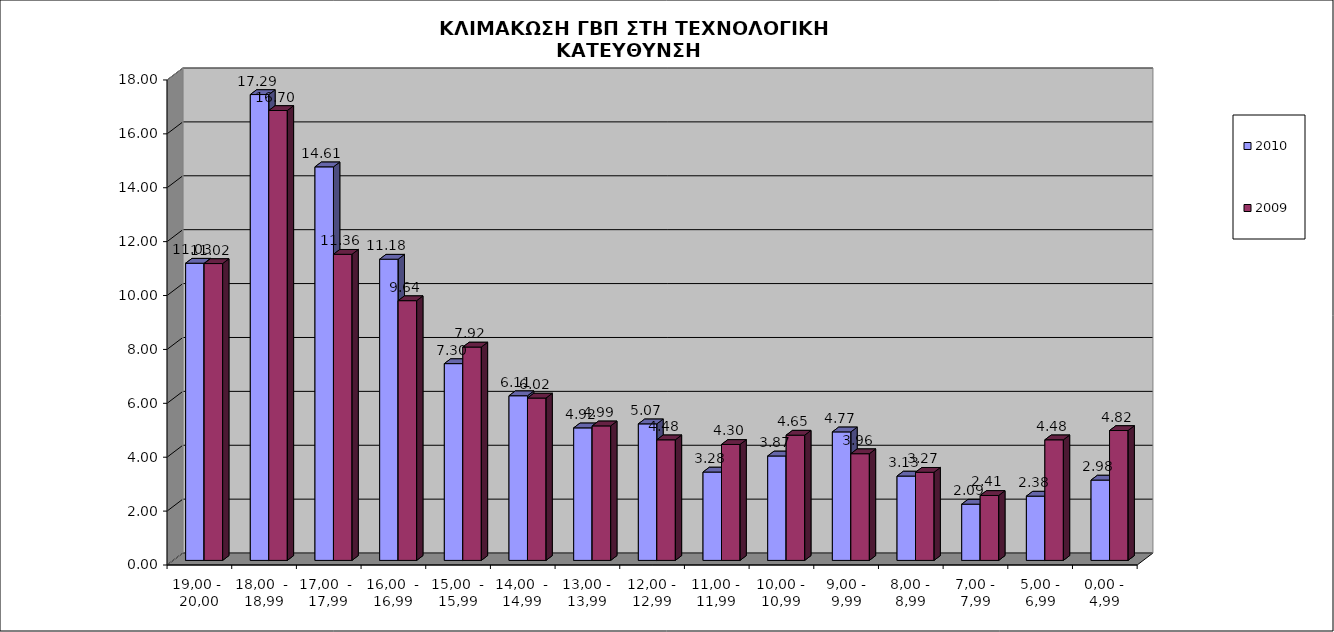
| Category | 2010 | 2009 |
|---|---|---|
| 19,00 -  20,00 | 11.028 | 11.015 |
| 18,00  -  18,99 | 17.288 | 16.695 |
| 17,00  -  17,99 | 14.605 | 11.36 |
| 16,00  - 16,99 | 11.177 | 9.639 |
| 15,00  - 15,99 | 7.303 | 7.917 |
| 14,00  - 14,99 | 6.11 | 6.024 |
| 13,00 - 13,99 | 4.918 | 4.991 |
| 12,00 - 12,99 | 5.067 | 4.475 |
| 11,00 - 11,99 | 3.279 | 4.303 |
| 10,00 - 10,99 | 3.875 | 4.647 |
| 9,00 - 9,99 | 4.769 | 3.959 |
| 8,00 - 8,99 | 3.13 | 3.27 |
| 7,00 - 7,99 | 2.086 | 2.41 |
| 5,00 - 6,99 | 2.385 | 4.475 |
| 0,00 - 4,99 | 2.981 | 4.819 |